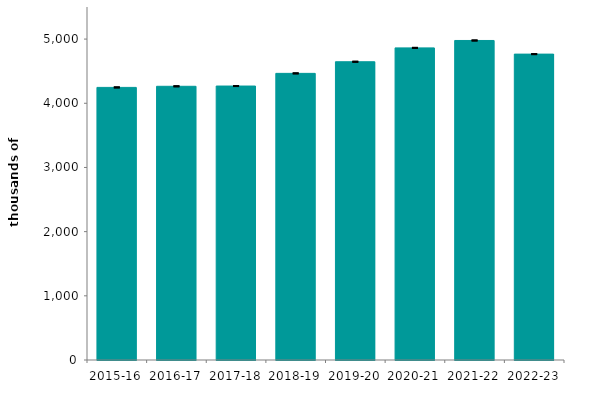
| Category | Series 0 |
|---|---|
| 2015-16 | 4247.297 |
| 2016-17 | 4264.586 |
| 2017-18 | 4268.524 |
| 2018-19 | 4465.893 |
| 2019-20 | 4647 |
| 2020-21 | 4863 |
| 2021-22 | 4978.434 |
| 2022-23 | 4765.899 |